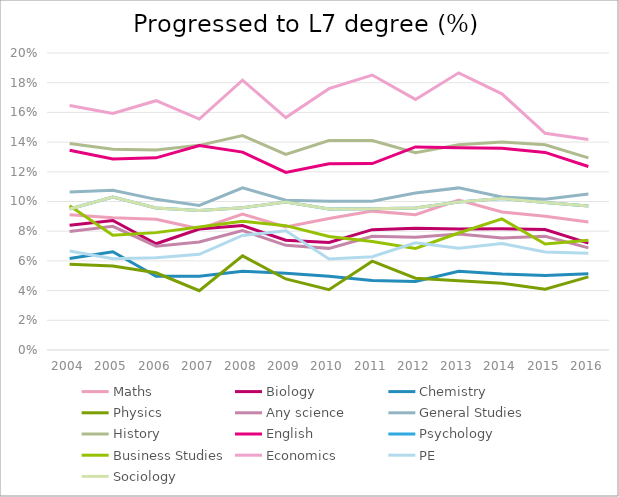
| Category | Maths | Biology | Chemistry | Physics | Any science | General Studies | History | English | Psychology | Business Studies | Economics | PE | Sociology |
|---|---|---|---|---|---|---|---|---|---|---|---|---|---|
| 2004.0 | 0.091 | 0.084 | 0.062 | 0.058 | 0.08 | 0.106 | 0.139 | 0.135 | 0.095 | 0.097 | 0.165 | 0.067 | 0.095 |
| 2005.0 | 0.089 | 0.087 | 0.066 | 0.057 | 0.083 | 0.107 | 0.135 | 0.129 | 0.103 | 0.077 | 0.159 | 0.062 | 0.103 |
| 2006.0 | 0.088 | 0.072 | 0.05 | 0.052 | 0.07 | 0.101 | 0.135 | 0.129 | 0.096 | 0.079 | 0.168 | 0.062 | 0.096 |
| 2007.0 | 0.082 | 0.081 | 0.05 | 0.04 | 0.073 | 0.097 | 0.138 | 0.138 | 0.094 | 0.083 | 0.155 | 0.064 | 0.094 |
| 2008.0 | 0.092 | 0.084 | 0.053 | 0.063 | 0.08 | 0.109 | 0.144 | 0.133 | 0.096 | 0.087 | 0.182 | 0.077 | 0.096 |
| 2009.0 | 0.083 | 0.074 | 0.052 | 0.048 | 0.07 | 0.101 | 0.132 | 0.12 | 0.1 | 0.084 | 0.157 | 0.08 | 0.1 |
| 2010.0 | 0.089 | 0.072 | 0.05 | 0.041 | 0.068 | 0.1 | 0.141 | 0.125 | 0.095 | 0.076 | 0.176 | 0.061 | 0.095 |
| 2011.0 | 0.094 | 0.081 | 0.047 | 0.06 | 0.077 | 0.1 | 0.141 | 0.126 | 0.095 | 0.073 | 0.185 | 0.063 | 0.095 |
| 2012.0 | 0.091 | 0.082 | 0.046 | 0.048 | 0.076 | 0.106 | 0.133 | 0.137 | 0.096 | 0.068 | 0.169 | 0.072 | 0.096 |
| 2013.0 | 0.101 | 0.081 | 0.053 | 0.047 | 0.078 | 0.109 | 0.138 | 0.136 | 0.1 | 0.079 | 0.187 | 0.068 | 0.1 |
| 2014.0 | 0.093 | 0.082 | 0.051 | 0.045 | 0.075 | 0.103 | 0.14 | 0.136 | 0.102 | 0.088 | 0.172 | 0.072 | 0.102 |
| 2015.0 | 0.09 | 0.081 | 0.05 | 0.041 | 0.077 | 0.102 | 0.138 | 0.133 | 0.099 | 0.071 | 0.146 | 0.066 | 0.099 |
| 2016.0 | 0.086 | 0.072 | 0.051 | 0.049 | 0.069 | 0.105 | 0.129 | 0.124 | 0.097 | 0.074 | 0.142 | 0.065 | 0.097 |